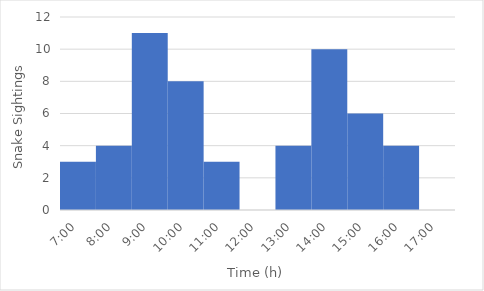
| Category | Snake Sightings |
|---|---|
| 7:00 | 3 |
| 8:00 | 4 |
| 9:00 | 11 |
| 10:00 | 8 |
| 11:00 | 3 |
| 12:00 | 0 |
| 13:00 | 4 |
| 14:00 | 10 |
| 15:00 | 6 |
| 16:00 | 4 |
| 17:00 | 0 |